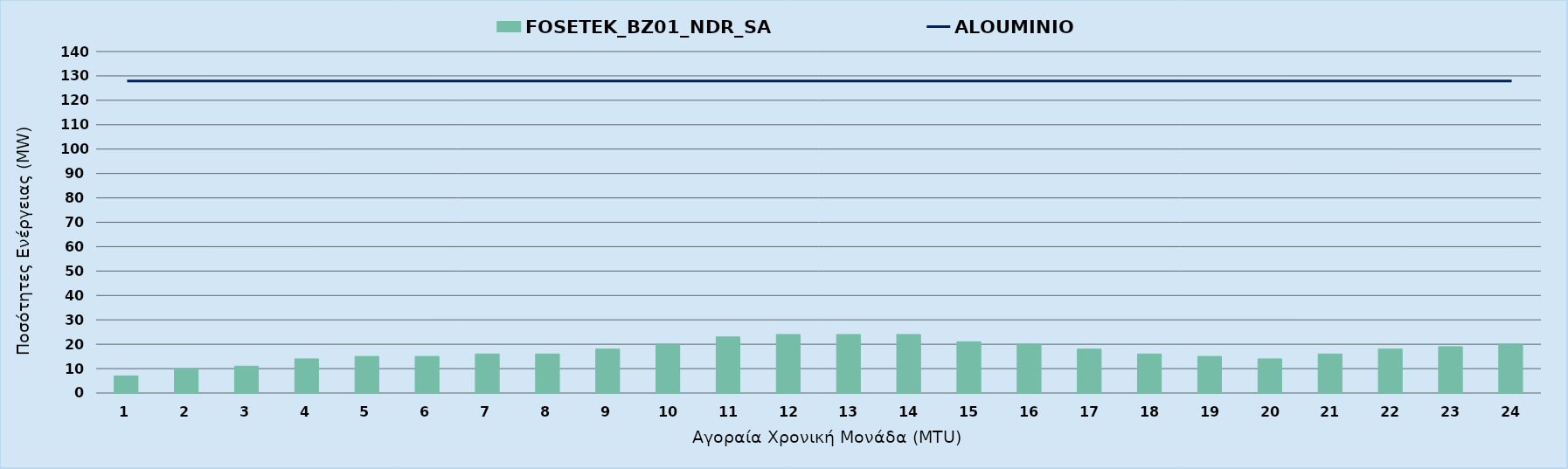
| Category | FOSETEK_BZ01_NDR_SA |
|---|---|
| 0 | 7 |
| 1 | 10 |
| 2 | 11 |
| 3 | 14 |
| 4 | 15 |
| 5 | 15 |
| 6 | 16 |
| 7 | 16 |
| 8 | 18 |
| 9 | 20 |
| 10 | 23 |
| 11 | 24 |
| 12 | 24 |
| 13 | 24 |
| 14 | 21 |
| 15 | 20 |
| 16 | 18 |
| 17 | 16 |
| 18 | 15 |
| 19 | 14 |
| 20 | 16 |
| 21 | 18 |
| 22 | 19 |
| 23 | 20 |